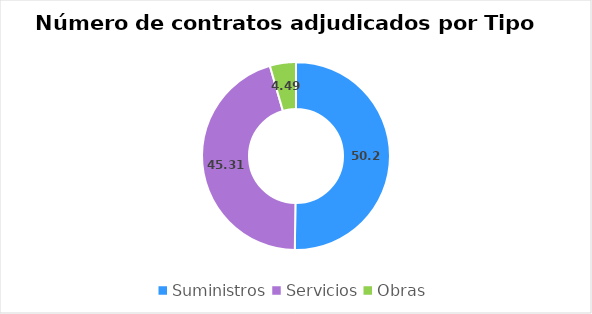
| Category | Series 0 |
|---|---|
| Suministros | 50.2 |
| Servicios | 45.31 |
| Obras | 4.49 |